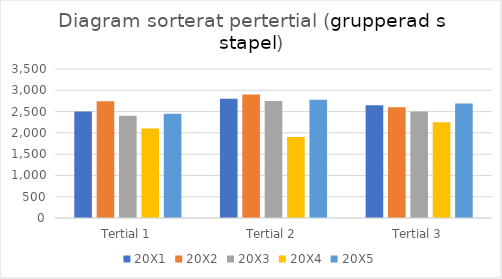
| Category | 20X1 | 20X2 | 20X3 | 20X4 | 20X5 |
|---|---|---|---|---|---|
| Tertial 1 | 2500 | 2740 | 2400 | 2100 | 2450 |
| Tertial 2 | 2800 | 2900 | 2750 | 1900 | 2780 |
| Tertial 3 | 2650 | 2600 | 2500 | 2250 | 2690 |